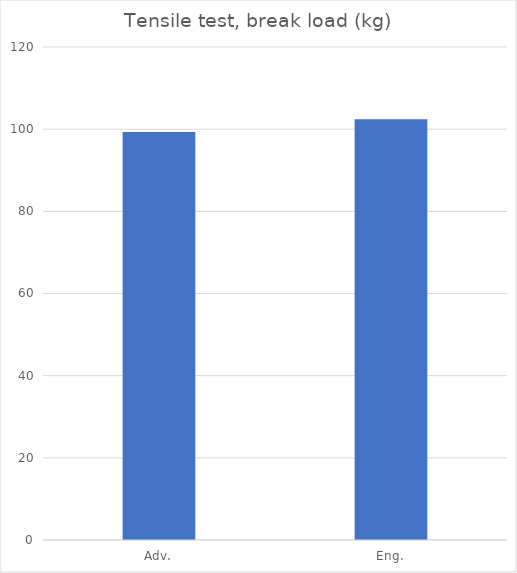
| Category | Average |
|---|---|
| Adv. | 99.3 |
| Eng. | 102.4 |